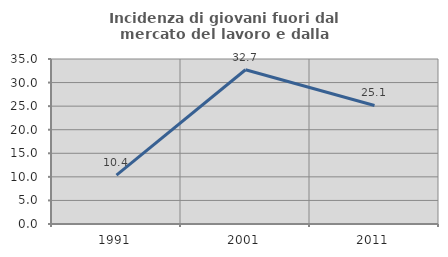
| Category | Incidenza di giovani fuori dal mercato del lavoro e dalla formazione  |
|---|---|
| 1991.0 | 10.354 |
| 2001.0 | 32.723 |
| 2011.0 | 25.14 |